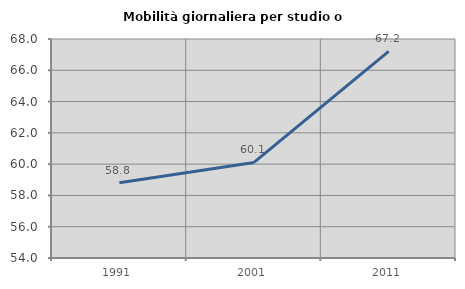
| Category | Mobilità giornaliera per studio o lavoro |
|---|---|
| 1991.0 | 58.811 |
| 2001.0 | 60.11 |
| 2011.0 | 67.208 |